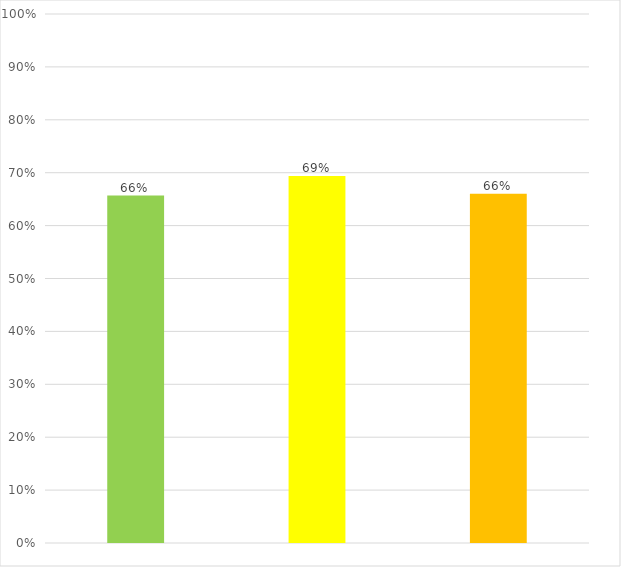
| Category | Series 0 |
|---|---|
| 0 | 0.657 |
| 1 | 0.694 |
| 2 | 0.66 |